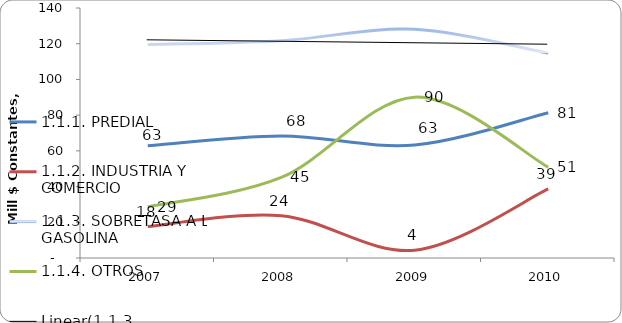
| Category | 1.1.1. PREDIAL | 1.1.2. INDUSTRIA Y COMERCIO | 1.1.3. SOBRETASA A LA GASOLINA | 1.1.4. OTROS |
|---|---|---|---|---|
| 2007 | 62.858 | 17.596 | 119.454 | 28.591 |
| 2008 | 68.331 | 23.718 | 121.712 | 45.108 |
| 2009 | 63.27 | 4.351 | 128.047 | 90.08 |
| 2010 | 81.327 | 38.648 | 114.61 | 50.861 |